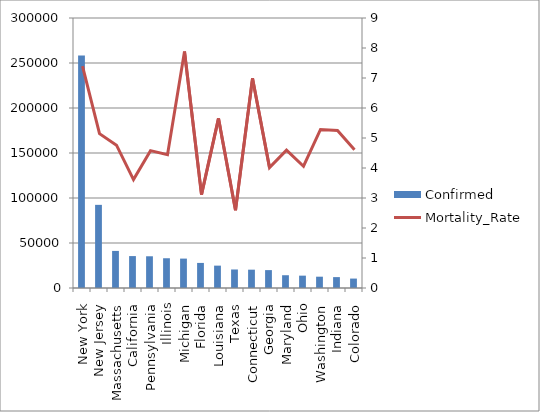
| Category | Confirmed |
|---|---|
| New York | 258361 |
| New Jersey | 92387 |
| Massachusetts | 41199 |
| California | 35465 |
| Pennsylvania | 35249 |
| Illinois | 33059 |
| Michigan | 32667 |
| Florida | 27869 |
| Louisiana | 24854 |
| Texas | 20574 |
| Connecticut | 20360 |
| Georgia | 19881 |
| Maryland | 14193 |
| Ohio | 13725 |
| Washington | 12563 |
| Indiana | 12097 |
| Colorado | 10473 |